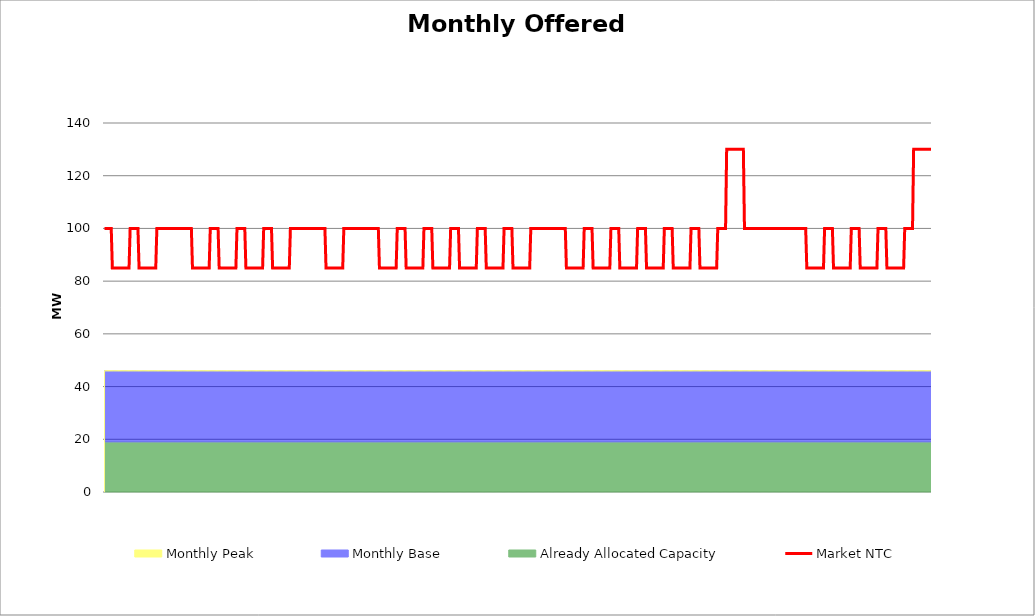
| Category | Market NTC |
|---|---|
| 0 | 100 |
| 1 | 100 |
| 2 | 100 |
| 3 | 100 |
| 4 | 100 |
| 5 | 100 |
| 6 | 100 |
| 7 | 85 |
| 8 | 85 |
| 9 | 85 |
| 10 | 85 |
| 11 | 85 |
| 12 | 85 |
| 13 | 85 |
| 14 | 85 |
| 15 | 85 |
| 16 | 85 |
| 17 | 85 |
| 18 | 85 |
| 19 | 85 |
| 20 | 85 |
| 21 | 85 |
| 22 | 85 |
| 23 | 100 |
| 24 | 100 |
| 25 | 100 |
| 26 | 100 |
| 27 | 100 |
| 28 | 100 |
| 29 | 100 |
| 30 | 100 |
| 31 | 85 |
| 32 | 85 |
| 33 | 85 |
| 34 | 85 |
| 35 | 85 |
| 36 | 85 |
| 37 | 85 |
| 38 | 85 |
| 39 | 85 |
| 40 | 85 |
| 41 | 85 |
| 42 | 85 |
| 43 | 85 |
| 44 | 85 |
| 45 | 85 |
| 46 | 85 |
| 47 | 100 |
| 48 | 100 |
| 49 | 100 |
| 50 | 100 |
| 51 | 100 |
| 52 | 100 |
| 53 | 100 |
| 54 | 100 |
| 55 | 100 |
| 56 | 100 |
| 57 | 100 |
| 58 | 100 |
| 59 | 100 |
| 60 | 100 |
| 61 | 100 |
| 62 | 100 |
| 63 | 100 |
| 64 | 100 |
| 65 | 100 |
| 66 | 100 |
| 67 | 100 |
| 68 | 100 |
| 69 | 100 |
| 70 | 100 |
| 71 | 100 |
| 72 | 100 |
| 73 | 100 |
| 74 | 100 |
| 75 | 100 |
| 76 | 100 |
| 77 | 100 |
| 78 | 100 |
| 79 | 85 |
| 80 | 85 |
| 81 | 85 |
| 82 | 85 |
| 83 | 85 |
| 84 | 85 |
| 85 | 85 |
| 86 | 85 |
| 87 | 85 |
| 88 | 85 |
| 89 | 85 |
| 90 | 85 |
| 91 | 85 |
| 92 | 85 |
| 93 | 85 |
| 94 | 85 |
| 95 | 100 |
| 96 | 100 |
| 97 | 100 |
| 98 | 100 |
| 99 | 100 |
| 100 | 100 |
| 101 | 100 |
| 102 | 100 |
| 103 | 85 |
| 104 | 85 |
| 105 | 85 |
| 106 | 85 |
| 107 | 85 |
| 108 | 85 |
| 109 | 85 |
| 110 | 85 |
| 111 | 85 |
| 112 | 85 |
| 113 | 85 |
| 114 | 85 |
| 115 | 85 |
| 116 | 85 |
| 117 | 85 |
| 118 | 85 |
| 119 | 100 |
| 120 | 100 |
| 121 | 100 |
| 122 | 100 |
| 123 | 100 |
| 124 | 100 |
| 125 | 100 |
| 126 | 100 |
| 127 | 85 |
| 128 | 85 |
| 129 | 85 |
| 130 | 85 |
| 131 | 85 |
| 132 | 85 |
| 133 | 85 |
| 134 | 85 |
| 135 | 85 |
| 136 | 85 |
| 137 | 85 |
| 138 | 85 |
| 139 | 85 |
| 140 | 85 |
| 141 | 85 |
| 142 | 85 |
| 143 | 100 |
| 144 | 100 |
| 145 | 100 |
| 146 | 100 |
| 147 | 100 |
| 148 | 100 |
| 149 | 100 |
| 150 | 100 |
| 151 | 85 |
| 152 | 85 |
| 153 | 85 |
| 154 | 85 |
| 155 | 85 |
| 156 | 85 |
| 157 | 85 |
| 158 | 85 |
| 159 | 85 |
| 160 | 85 |
| 161 | 85 |
| 162 | 85 |
| 163 | 85 |
| 164 | 85 |
| 165 | 85 |
| 166 | 85 |
| 167 | 100 |
| 168 | 100 |
| 169 | 100 |
| 170 | 100 |
| 171 | 100 |
| 172 | 100 |
| 173 | 100 |
| 174 | 100 |
| 175 | 100 |
| 176 | 100 |
| 177 | 100 |
| 178 | 100 |
| 179 | 100 |
| 180 | 100 |
| 181 | 100 |
| 182 | 100 |
| 183 | 100 |
| 184 | 100 |
| 185 | 100 |
| 186 | 100 |
| 187 | 100 |
| 188 | 100 |
| 189 | 100 |
| 190 | 100 |
| 191 | 100 |
| 192 | 100 |
| 193 | 100 |
| 194 | 100 |
| 195 | 100 |
| 196 | 100 |
| 197 | 100 |
| 198 | 100 |
| 199 | 85 |
| 200 | 85 |
| 201 | 85 |
| 202 | 85 |
| 203 | 85 |
| 204 | 85 |
| 205 | 85 |
| 206 | 85 |
| 207 | 85 |
| 208 | 85 |
| 209 | 85 |
| 210 | 85 |
| 211 | 85 |
| 212 | 85 |
| 213 | 85 |
| 214 | 85 |
| 215 | 100 |
| 216 | 100 |
| 217 | 100 |
| 218 | 100 |
| 219 | 100 |
| 220 | 100 |
| 221 | 100 |
| 222 | 100 |
| 223 | 100 |
| 224 | 100 |
| 225 | 100 |
| 226 | 100 |
| 227 | 100 |
| 228 | 100 |
| 229 | 100 |
| 230 | 100 |
| 231 | 100 |
| 232 | 100 |
| 233 | 100 |
| 234 | 100 |
| 235 | 100 |
| 236 | 100 |
| 237 | 100 |
| 238 | 100 |
| 239 | 100 |
| 240 | 100 |
| 241 | 100 |
| 242 | 100 |
| 243 | 100 |
| 244 | 100 |
| 245 | 100 |
| 246 | 100 |
| 247 | 85 |
| 248 | 85 |
| 249 | 85 |
| 250 | 85 |
| 251 | 85 |
| 252 | 85 |
| 253 | 85 |
| 254 | 85 |
| 255 | 85 |
| 256 | 85 |
| 257 | 85 |
| 258 | 85 |
| 259 | 85 |
| 260 | 85 |
| 261 | 85 |
| 262 | 85 |
| 263 | 100 |
| 264 | 100 |
| 265 | 100 |
| 266 | 100 |
| 267 | 100 |
| 268 | 100 |
| 269 | 100 |
| 270 | 100 |
| 271 | 85 |
| 272 | 85 |
| 273 | 85 |
| 274 | 85 |
| 275 | 85 |
| 276 | 85 |
| 277 | 85 |
| 278 | 85 |
| 279 | 85 |
| 280 | 85 |
| 281 | 85 |
| 282 | 85 |
| 283 | 85 |
| 284 | 85 |
| 285 | 85 |
| 286 | 85 |
| 287 | 100 |
| 288 | 100 |
| 289 | 100 |
| 290 | 100 |
| 291 | 100 |
| 292 | 100 |
| 293 | 100 |
| 294 | 100 |
| 295 | 85 |
| 296 | 85 |
| 297 | 85 |
| 298 | 85 |
| 299 | 85 |
| 300 | 85 |
| 301 | 85 |
| 302 | 85 |
| 303 | 85 |
| 304 | 85 |
| 305 | 85 |
| 306 | 85 |
| 307 | 85 |
| 308 | 85 |
| 309 | 85 |
| 310 | 85 |
| 311 | 100 |
| 312 | 100 |
| 313 | 100 |
| 314 | 100 |
| 315 | 100 |
| 316 | 100 |
| 317 | 100 |
| 318 | 100 |
| 319 | 85 |
| 320 | 85 |
| 321 | 85 |
| 322 | 85 |
| 323 | 85 |
| 324 | 85 |
| 325 | 85 |
| 326 | 85 |
| 327 | 85 |
| 328 | 85 |
| 329 | 85 |
| 330 | 85 |
| 331 | 85 |
| 332 | 85 |
| 333 | 85 |
| 334 | 85 |
| 335 | 100 |
| 336 | 100 |
| 337 | 100 |
| 338 | 100 |
| 339 | 100 |
| 340 | 100 |
| 341 | 100 |
| 342 | 100 |
| 343 | 85 |
| 344 | 85 |
| 345 | 85 |
| 346 | 85 |
| 347 | 85 |
| 348 | 85 |
| 349 | 85 |
| 350 | 85 |
| 351 | 85 |
| 352 | 85 |
| 353 | 85 |
| 354 | 85 |
| 355 | 85 |
| 356 | 85 |
| 357 | 85 |
| 358 | 85 |
| 359 | 100 |
| 360 | 100 |
| 361 | 100 |
| 362 | 100 |
| 363 | 100 |
| 364 | 100 |
| 365 | 100 |
| 366 | 100 |
| 367 | 85 |
| 368 | 85 |
| 369 | 85 |
| 370 | 85 |
| 371 | 85 |
| 372 | 85 |
| 373 | 85 |
| 374 | 85 |
| 375 | 85 |
| 376 | 85 |
| 377 | 85 |
| 378 | 85 |
| 379 | 85 |
| 380 | 85 |
| 381 | 85 |
| 382 | 85 |
| 383 | 100 |
| 384 | 100 |
| 385 | 100 |
| 386 | 100 |
| 387 | 100 |
| 388 | 100 |
| 389 | 100 |
| 390 | 100 |
| 391 | 100 |
| 392 | 100 |
| 393 | 100 |
| 394 | 100 |
| 395 | 100 |
| 396 | 100 |
| 397 | 100 |
| 398 | 100 |
| 399 | 100 |
| 400 | 100 |
| 401 | 100 |
| 402 | 100 |
| 403 | 100 |
| 404 | 100 |
| 405 | 100 |
| 406 | 100 |
| 407 | 100 |
| 408 | 100 |
| 409 | 100 |
| 410 | 100 |
| 411 | 100 |
| 412 | 100 |
| 413 | 100 |
| 414 | 100 |
| 415 | 85 |
| 416 | 85 |
| 417 | 85 |
| 418 | 85 |
| 419 | 85 |
| 420 | 85 |
| 421 | 85 |
| 422 | 85 |
| 423 | 85 |
| 424 | 85 |
| 425 | 85 |
| 426 | 85 |
| 427 | 85 |
| 428 | 85 |
| 429 | 85 |
| 430 | 85 |
| 431 | 100 |
| 432 | 100 |
| 433 | 100 |
| 434 | 100 |
| 435 | 100 |
| 436 | 100 |
| 437 | 100 |
| 438 | 100 |
| 439 | 85 |
| 440 | 85 |
| 441 | 85 |
| 442 | 85 |
| 443 | 85 |
| 444 | 85 |
| 445 | 85 |
| 446 | 85 |
| 447 | 85 |
| 448 | 85 |
| 449 | 85 |
| 450 | 85 |
| 451 | 85 |
| 452 | 85 |
| 453 | 85 |
| 454 | 85 |
| 455 | 100 |
| 456 | 100 |
| 457 | 100 |
| 458 | 100 |
| 459 | 100 |
| 460 | 100 |
| 461 | 100 |
| 462 | 100 |
| 463 | 85 |
| 464 | 85 |
| 465 | 85 |
| 466 | 85 |
| 467 | 85 |
| 468 | 85 |
| 469 | 85 |
| 470 | 85 |
| 471 | 85 |
| 472 | 85 |
| 473 | 85 |
| 474 | 85 |
| 475 | 85 |
| 476 | 85 |
| 477 | 85 |
| 478 | 85 |
| 479 | 100 |
| 480 | 100 |
| 481 | 100 |
| 482 | 100 |
| 483 | 100 |
| 484 | 100 |
| 485 | 100 |
| 486 | 100 |
| 487 | 85 |
| 488 | 85 |
| 489 | 85 |
| 490 | 85 |
| 491 | 85 |
| 492 | 85 |
| 493 | 85 |
| 494 | 85 |
| 495 | 85 |
| 496 | 85 |
| 497 | 85 |
| 498 | 85 |
| 499 | 85 |
| 500 | 85 |
| 501 | 85 |
| 502 | 85 |
| 503 | 100 |
| 504 | 100 |
| 505 | 100 |
| 506 | 100 |
| 507 | 100 |
| 508 | 100 |
| 509 | 100 |
| 510 | 100 |
| 511 | 85 |
| 512 | 85 |
| 513 | 85 |
| 514 | 85 |
| 515 | 85 |
| 516 | 85 |
| 517 | 85 |
| 518 | 85 |
| 519 | 85 |
| 520 | 85 |
| 521 | 85 |
| 522 | 85 |
| 523 | 85 |
| 524 | 85 |
| 525 | 85 |
| 526 | 85 |
| 527 | 100 |
| 528 | 100 |
| 529 | 100 |
| 530 | 100 |
| 531 | 100 |
| 532 | 100 |
| 533 | 100 |
| 534 | 100 |
| 535 | 85 |
| 536 | 85 |
| 537 | 85 |
| 538 | 85 |
| 539 | 85 |
| 540 | 85 |
| 541 | 85 |
| 542 | 85 |
| 543 | 85 |
| 544 | 85 |
| 545 | 85 |
| 546 | 85 |
| 547 | 85 |
| 548 | 85 |
| 549 | 85 |
| 550 | 85 |
| 551 | 100 |
| 552 | 100 |
| 553 | 100 |
| 554 | 100 |
| 555 | 100 |
| 556 | 100 |
| 557 | 100 |
| 558 | 100 |
| 559 | 130 |
| 560 | 130 |
| 561 | 130 |
| 562 | 130 |
| 563 | 130 |
| 564 | 130 |
| 565 | 130 |
| 566 | 130 |
| 567 | 130 |
| 568 | 130 |
| 569 | 130 |
| 570 | 130 |
| 571 | 130 |
| 572 | 130 |
| 573 | 130 |
| 574 | 130 |
| 575 | 100 |
| 576 | 100 |
| 577 | 100 |
| 578 | 100 |
| 579 | 100 |
| 580 | 100 |
| 581 | 100 |
| 582 | 100 |
| 583 | 100 |
| 584 | 100 |
| 585 | 100 |
| 586 | 100 |
| 587 | 100 |
| 588 | 100 |
| 589 | 100 |
| 590 | 100 |
| 591 | 100 |
| 592 | 100 |
| 593 | 100 |
| 594 | 100 |
| 595 | 100 |
| 596 | 100 |
| 597 | 100 |
| 598 | 100 |
| 599 | 100 |
| 600 | 100 |
| 601 | 100 |
| 602 | 100 |
| 603 | 100 |
| 604 | 100 |
| 605 | 100 |
| 606 | 100 |
| 607 | 100 |
| 608 | 100 |
| 609 | 100 |
| 610 | 100 |
| 611 | 100 |
| 612 | 100 |
| 613 | 100 |
| 614 | 100 |
| 615 | 100 |
| 616 | 100 |
| 617 | 100 |
| 618 | 100 |
| 619 | 100 |
| 620 | 100 |
| 621 | 100 |
| 622 | 100 |
| 623 | 100 |
| 624 | 100 |
| 625 | 100 |
| 626 | 100 |
| 627 | 100 |
| 628 | 100 |
| 629 | 100 |
| 630 | 100 |
| 631 | 85 |
| 632 | 85 |
| 633 | 85 |
| 634 | 85 |
| 635 | 85 |
| 636 | 85 |
| 637 | 85 |
| 638 | 85 |
| 639 | 85 |
| 640 | 85 |
| 641 | 85 |
| 642 | 85 |
| 643 | 85 |
| 644 | 85 |
| 645 | 85 |
| 646 | 85 |
| 647 | 100 |
| 648 | 100 |
| 649 | 100 |
| 650 | 100 |
| 651 | 100 |
| 652 | 100 |
| 653 | 100 |
| 654 | 100 |
| 655 | 85 |
| 656 | 85 |
| 657 | 85 |
| 658 | 85 |
| 659 | 85 |
| 660 | 85 |
| 661 | 85 |
| 662 | 85 |
| 663 | 85 |
| 664 | 85 |
| 665 | 85 |
| 666 | 85 |
| 667 | 85 |
| 668 | 85 |
| 669 | 85 |
| 670 | 85 |
| 671 | 100 |
| 672 | 100 |
| 673 | 100 |
| 674 | 100 |
| 675 | 100 |
| 676 | 100 |
| 677 | 100 |
| 678 | 100 |
| 679 | 85 |
| 680 | 85 |
| 681 | 85 |
| 682 | 85 |
| 683 | 85 |
| 684 | 85 |
| 685 | 85 |
| 686 | 85 |
| 687 | 85 |
| 688 | 85 |
| 689 | 85 |
| 690 | 85 |
| 691 | 85 |
| 692 | 85 |
| 693 | 85 |
| 694 | 85 |
| 695 | 100 |
| 696 | 100 |
| 697 | 100 |
| 698 | 100 |
| 699 | 100 |
| 700 | 100 |
| 701 | 100 |
| 702 | 100 |
| 703 | 85 |
| 704 | 85 |
| 705 | 85 |
| 706 | 85 |
| 707 | 85 |
| 708 | 85 |
| 709 | 85 |
| 710 | 85 |
| 711 | 85 |
| 712 | 85 |
| 713 | 85 |
| 714 | 85 |
| 715 | 85 |
| 716 | 85 |
| 717 | 85 |
| 718 | 85 |
| 719 | 100 |
| 720 | 100 |
| 721 | 100 |
| 722 | 100 |
| 723 | 100 |
| 724 | 100 |
| 725 | 100 |
| 726 | 100 |
| 727 | 130 |
| 728 | 130 |
| 729 | 130 |
| 730 | 130 |
| 731 | 130 |
| 732 | 130 |
| 733 | 130 |
| 734 | 130 |
| 735 | 130 |
| 736 | 130 |
| 737 | 130 |
| 738 | 130 |
| 739 | 130 |
| 740 | 130 |
| 741 | 130 |
| 742 | 130 |
| 743 | 130 |